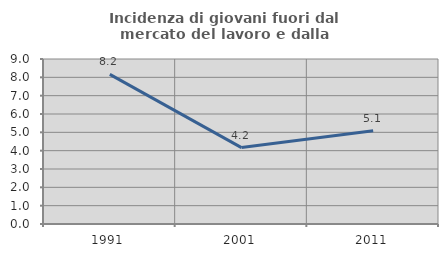
| Category | Incidenza di giovani fuori dal mercato del lavoro e dalla formazione  |
|---|---|
| 1991.0 | 8.163 |
| 2001.0 | 4.167 |
| 2011.0 | 5.085 |